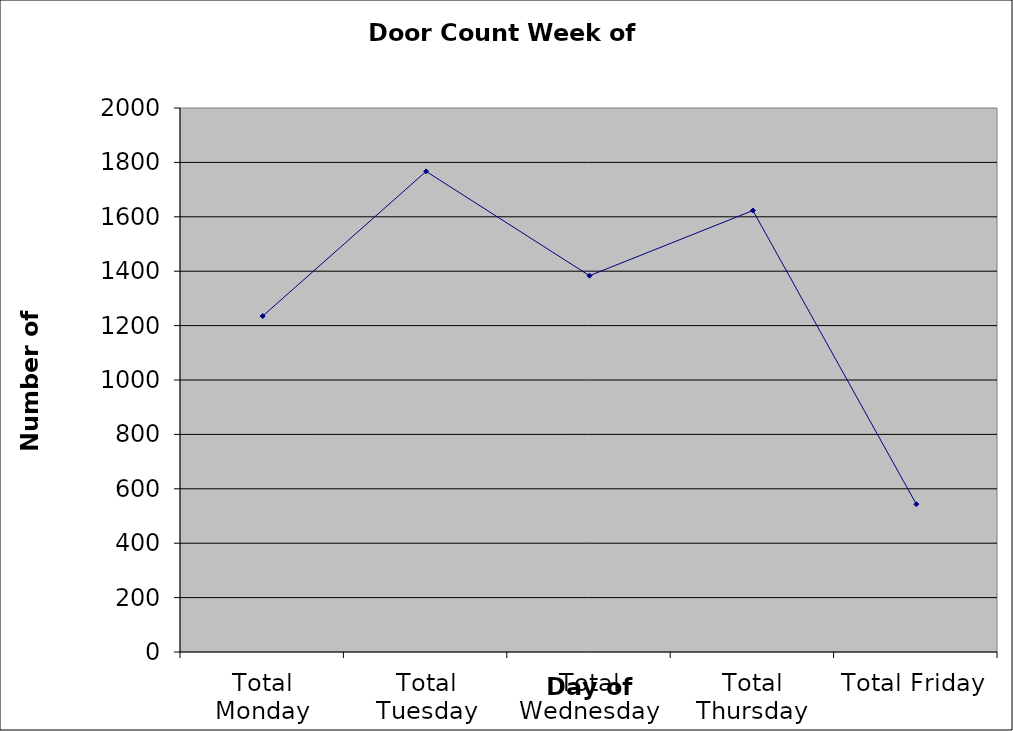
| Category | Series 0 |
|---|---|
| Total Monday | 1235 |
| Total Tuesday | 1767 |
| Total Wednesday | 1383.5 |
| Total Thursday | 1623 |
| Total Friday | 543.5 |